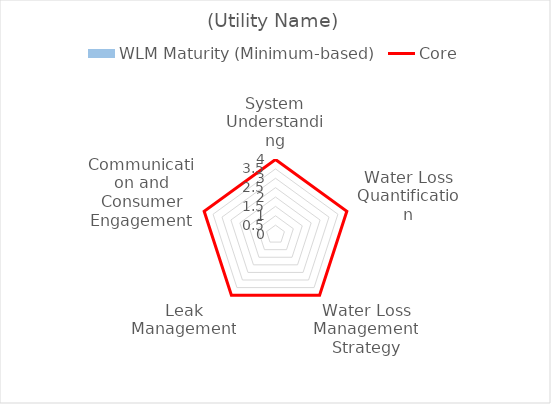
| Category | WLM Maturity (Minimum-based) |
|---|---|
| System Understanding | 0 |
| Water Loss Quantification | 0 |
| Water Loss Management Strategy | 0 |
| Leak Management | 0 |
| Communication and Consumer Engagement | 0 |